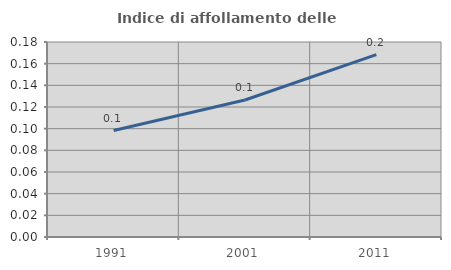
| Category | Indice di affollamento delle abitazioni  |
|---|---|
| 1991.0 | 0.098 |
| 2001.0 | 0.126 |
| 2011.0 | 0.168 |